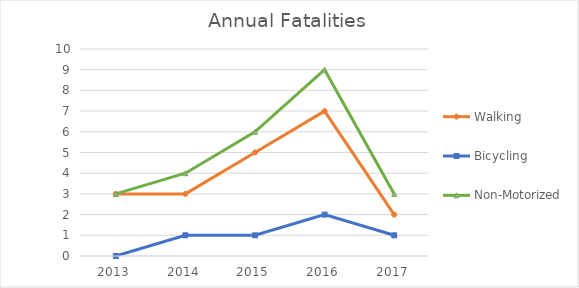
| Category | Walking | Bicycling | Non-Motorized |
|---|---|---|---|
| 2013 | 3 | 0 | 3 |
| 2014 | 3 | 1 | 4 |
| 2015 | 5 | 1 | 6 |
| 2016 | 7 | 2 | 9 |
| 2017 | 2 | 1 | 3 |